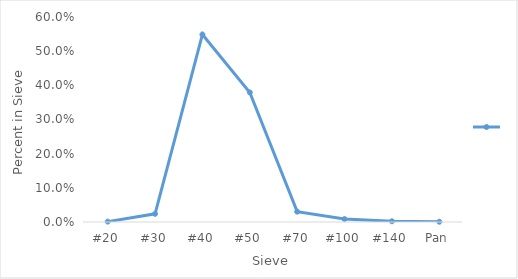
| Category | Series 0 |
|---|---|
| #20 | 0.001 |
| #30 | 0.024 |
| #40 | 0.549 |
| #50 | 0.379 |
| #70 | 0.03 |
| #100 | 0.009 |
| #140 | 0.002 |
| Pan | 0.001 |